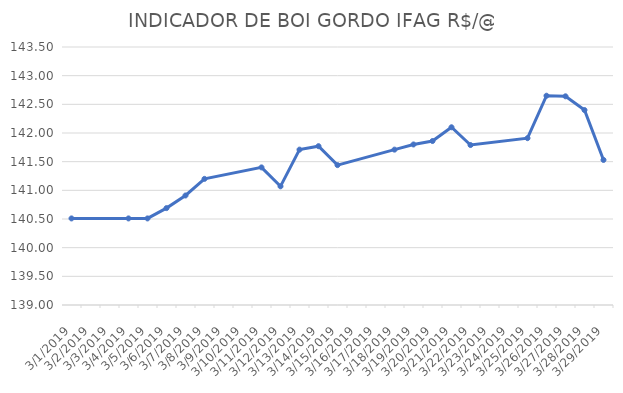
| Category | INDICADOR DE BOI GORDO IFAG |
|---|---|
| 3/1/19 | 140.51 |
| 3/4/19 | 140.51 |
| 3/5/19 | 140.51 |
| 3/6/19 | 140.69 |
| 3/7/19 | 140.91 |
| 3/8/19 | 141.2 |
| 3/11/19 | 141.4 |
| 3/12/19 | 141.07 |
| 3/13/19 | 141.71 |
| 3/14/19 | 141.77 |
| 3/15/19 | 141.44 |
| 3/18/19 | 141.71 |
| 3/19/19 | 141.8 |
| 3/20/19 | 141.86 |
| 3/21/19 | 142.1 |
| 3/22/19 | 141.79 |
| 3/25/19 | 141.91 |
| 3/26/19 | 142.65 |
| 3/27/19 | 142.64 |
| 3/28/19 | 142.4 |
| 3/29/19 | 141.53 |